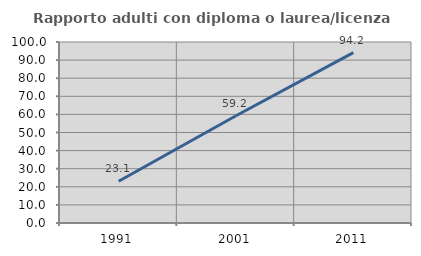
| Category | Rapporto adulti con diploma o laurea/licenza media  |
|---|---|
| 1991.0 | 23.077 |
| 2001.0 | 59.236 |
| 2011.0 | 94.156 |